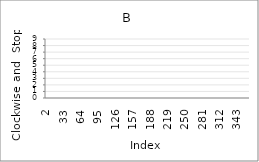
| Category | Series 0 |
|---|---|
| 2.0 | 4 |
| 3.0 | 6 |
| 4.0 | 1 |
| 5.0 | 3 |
| 6.0 | 7 |
| 7.0 | 7 |
| 8.0 | 2 |
| 9.0 | 2 |
| 10.0 | 3 |
| 11.0 | 6 |
| 12.0 | 4 |
| 13.0 | 9 |
| 14.0 | 1 |
| 15.0 | 0 |
| 16.0 | 0 |
| 17.0 | 0 |
| 18.0 | 2 |
| 19.0 | 3 |
| 20.0 | 2 |
| 21.0 | 7 |
| 22.0 | 5 |
| 23.0 | 6 |
| 24.0 | 1 |
| 25.0 | 4 |
| 26.0 | 0 |
| 27.0 | 6 |
| 28.0 | 4 |
| 29.0 | 8 |
| 30.0 | 0 |
| 31.0 | 99 |
| 32.0 | 99 |
| 33.0 | 99 |
| 34.0 | 99 |
| 35.0 | 99 |
| 36.0 | 99 |
| 37.0 | 99 |
| 38.0 | 99 |
| 39.0 | 99 |
| 40.0 | 99 |
| 41.0 | 99 |
| 42.0 | 99 |
| 43.0 | 99 |
| 44.0 | 99 |
| 45.0 | 99 |
| 46.0 | 99 |
| 47.0 | 99 |
| 48.0 | 99 |
| 49.0 | 99 |
| 50.0 | 99 |
| 51.0 | 99 |
| 52.0 | 99 |
| 53.0 | 99 |
| 54.0 | 99 |
| 55.0 | 99 |
| 56.0 | 99 |
| 57.0 | 99 |
| 58.0 | 99 |
| 59.0 | 99 |
| 60.0 | 99 |
| 61.0 | 99 |
| 62.0 | 99 |
| 63.0 | 99 |
| 64.0 | 99 |
| 65.0 | 99 |
| 66.0 | 99 |
| 67.0 | 99 |
| 68.0 | 99 |
| 69.0 | 99 |
| 70.0 | 99 |
| 71.0 | 99 |
| 72.0 | 99 |
| 73.0 | 99 |
| 74.0 | 99 |
| 75.0 | 99 |
| 76.0 | 99 |
| 77.0 | 99 |
| 78.0 | 99 |
| 79.0 | 99 |
| 80.0 | 99 |
| 81.0 | 99 |
| 82.0 | 99 |
| 83.0 | 99 |
| 84.0 | 99 |
| 85.0 | 99 |
| 86.0 | 99 |
| 87.0 | 99 |
| 88.0 | 99 |
| 89.0 | 99 |
| 90.0 | 99 |
| 91.0 | 99 |
| 92.0 | 99 |
| 93.0 | 99 |
| 94.0 | 99 |
| 95.0 | 99 |
| 96.0 | 99 |
| 97.0 | 99 |
| 98.0 | 99 |
| 99.0 | 99 |
| 100.0 | 99 |
| 101.0 | 99 |
| 102.0 | 99 |
| 103.0 | 99 |
| 104.0 | 99 |
| 105.0 | 99 |
| 106.0 | 99 |
| 107.0 | 99 |
| 108.0 | 99 |
| 109.0 | 99 |
| 110.0 | 99 |
| 111.0 | 99 |
| 112.0 | 99 |
| 113.0 | 99 |
| 114.0 | 99 |
| 115.0 | 99 |
| 116.0 | 99 |
| 117.0 | 99 |
| 118.0 | 99 |
| 119.0 | 99 |
| 120.0 | 99 |
| 121.0 | 99 |
| 122.0 | 99 |
| 123.0 | 99 |
| 124.0 | 99 |
| 125.0 | 99 |
| 126.0 | 99 |
| 127.0 | 99 |
| 128.0 | 99 |
| 129.0 | 99 |
| 130.0 | 99 |
| 131.0 | 99 |
| 132.0 | 99 |
| 133.0 | 99 |
| 134.0 | 99 |
| 135.0 | 99 |
| 136.0 | 99 |
| 137.0 | 99 |
| 138.0 | 99 |
| 139.0 | 99 |
| 140.0 | 99 |
| 141.0 | 99 |
| 142.0 | 99 |
| 143.0 | 99 |
| 144.0 | 99 |
| 145.0 | 99 |
| 146.0 | 99 |
| 147.0 | 99 |
| 148.0 | 99 |
| 149.0 | 99 |
| 150.0 | 99 |
| 151.0 | 99 |
| 152.0 | 99 |
| 153.0 | 99 |
| 154.0 | 99 |
| 155.0 | 99 |
| 156.0 | 99 |
| 157.0 | 99 |
| 158.0 | 99 |
| 159.0 | 99 |
| 160.0 | 99 |
| 161.0 | 99 |
| 162.0 | 99 |
| 163.0 | 99 |
| 164.0 | 99 |
| 165.0 | 99 |
| 166.0 | 99 |
| 167.0 | 99 |
| 168.0 | 99 |
| 169.0 | 99 |
| 170.0 | 99 |
| 171.0 | 99 |
| 172.0 | 99 |
| 173.0 | 99 |
| 174.0 | 99 |
| 175.0 | 99 |
| 176.0 | 99 |
| 177.0 | 99 |
| 178.0 | 99 |
| 179.0 | 99 |
| 180.0 | 99 |
| 181.0 | 99 |
| 182.0 | 99 |
| 183.0 | 99 |
| 184.0 | 99 |
| 185.0 | 99 |
| 186.0 | 99 |
| 187.0 | 99 |
| 188.0 | 99 |
| 189.0 | 99 |
| 190.0 | 99 |
| 191.0 | 99 |
| 192.0 | 99 |
| 193.0 | 99 |
| 194.0 | 99 |
| 195.0 | 99 |
| 196.0 | 99 |
| 197.0 | 99 |
| 198.0 | 99 |
| 199.0 | 99 |
| 200.0 | 99 |
| 201.0 | 99 |
| 202.0 | 99 |
| 203.0 | 99 |
| 204.0 | 99 |
| 205.0 | 99 |
| 206.0 | 99 |
| 207.0 | 99 |
| 208.0 | 99 |
| 209.0 | 99 |
| 210.0 | 99 |
| 211.0 | 99 |
| 212.0 | 99 |
| 213.0 | 99 |
| 214.0 | 99 |
| 215.0 | 99 |
| 216.0 | 99 |
| 217.0 | 99 |
| 218.0 | 99 |
| 219.0 | 99 |
| 220.0 | 99 |
| 221.0 | 99 |
| 222.0 | 99 |
| 223.0 | 99 |
| 224.0 | 99 |
| 225.0 | 99 |
| 226.0 | 99 |
| 227.0 | 99 |
| 228.0 | 99 |
| 229.0 | 99 |
| 230.0 | 99 |
| 231.0 | 99 |
| 232.0 | 99 |
| 233.0 | 99 |
| 234.0 | 99 |
| 235.0 | 99 |
| 236.0 | 99 |
| 237.0 | 99 |
| 238.0 | 99 |
| 239.0 | 99 |
| 240.0 | 99 |
| 241.0 | 99 |
| 242.0 | 99 |
| 243.0 | 99 |
| 244.0 | 99 |
| 245.0 | 99 |
| 246.0 | 99 |
| 247.0 | 99 |
| 248.0 | 99 |
| 249.0 | 99 |
| 250.0 | 99 |
| 251.0 | 99 |
| 252.0 | 99 |
| 253.0 | 99 |
| 254.0 | 99 |
| 255.0 | 99 |
| 256.0 | 99 |
| 257.0 | 99 |
| 258.0 | 99 |
| 259.0 | 99 |
| 260.0 | 99 |
| 261.0 | 99 |
| 262.0 | 99 |
| 263.0 | 99 |
| 264.0 | 99 |
| 265.0 | 99 |
| 266.0 | 99 |
| 267.0 | 99 |
| 268.0 | 99 |
| 269.0 | 99 |
| 270.0 | 99 |
| 271.0 | 99 |
| 272.0 | 99 |
| 273.0 | 99 |
| 274.0 | 99 |
| 275.0 | 99 |
| 276.0 | 99 |
| 277.0 | 99 |
| 278.0 | 99 |
| 279.0 | 99 |
| 280.0 | 99 |
| 281.0 | 99 |
| 282.0 | 99 |
| 283.0 | 99 |
| 284.0 | 99 |
| 285.0 | 99 |
| 286.0 | 99 |
| 287.0 | 99 |
| 288.0 | 99 |
| 289.0 | 99 |
| 290.0 | 99 |
| 291.0 | 99 |
| 292.0 | 99 |
| 293.0 | 99 |
| 294.0 | 99 |
| 295.0 | 99 |
| 296.0 | 99 |
| 297.0 | 99 |
| 298.0 | 99 |
| 299.0 | 99 |
| 300.0 | 99 |
| 301.0 | 99 |
| 302.0 | 99 |
| 303.0 | 99 |
| 304.0 | 99 |
| 305.0 | 99 |
| 306.0 | 99 |
| 307.0 | 99 |
| 308.0 | 99 |
| 309.0 | 99 |
| 310.0 | 99 |
| 311.0 | 99 |
| 312.0 | 99 |
| 313.0 | 99 |
| 314.0 | 99 |
| 315.0 | 99 |
| 316.0 | 99 |
| 317.0 | 99 |
| 318.0 | 99 |
| 319.0 | 99 |
| 320.0 | 99 |
| 321.0 | 99 |
| 322.0 | 99 |
| 323.0 | 99 |
| 324.0 | 99 |
| 325.0 | 99 |
| 326.0 | 99 |
| 327.0 | 99 |
| 328.0 | 99 |
| 329.0 | 99 |
| 330.0 | 99 |
| 331.0 | 99 |
| 332.0 | 99 |
| 333.0 | 99 |
| 334.0 | 99 |
| 335.0 | 99 |
| 336.0 | 99 |
| 337.0 | 99 |
| 338.0 | 99 |
| 339.0 | 99 |
| 340.0 | 99 |
| 341.0 | 99 |
| 342.0 | 99 |
| 343.0 | 99 |
| 344.0 | 99 |
| 345.0 | 99 |
| 346.0 | 99 |
| 347.0 | 99 |
| 348.0 | 99 |
| 349.0 | 99 |
| 350.0 | 99 |
| 351.0 | 99 |
| 352.0 | 99 |
| 353.0 | 99 |
| 354.0 | 99 |
| 355.0 | 99 |
| 356.0 | 99 |
| 357.0 | 99 |
| 358.0 | 99 |
| 359.0 | 99 |
| 360.0 | 99 |
| 361.0 | 99 |
| 362.0 | 99 |
| 363.0 | 99 |
| 364.0 | 99 |
| 365.0 | 99 |